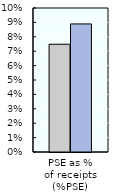
| Category | 2000-02 | 2018-20 |
|---|---|---|
| PSE as %
of receipts (%PSE) | 0.075 | 0.089 |